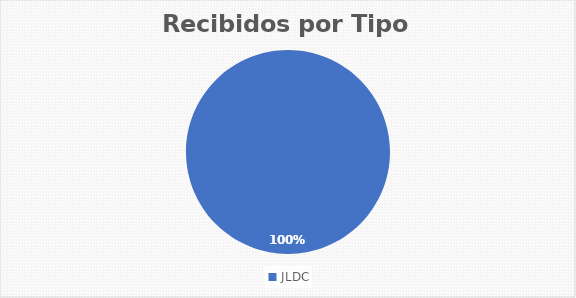
| Category | Series 0 |
|---|---|
| JLDC | 6 |